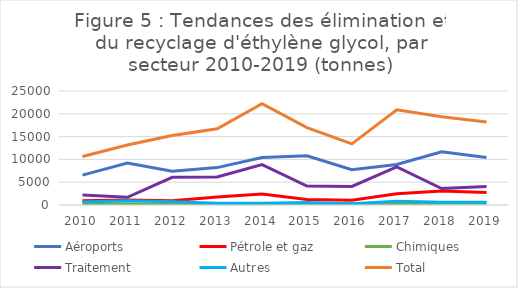
| Category | Aéroports | Pétrole et gaz | Chimiques | Traitement | Autres | Total |
|---|---|---|---|---|---|---|
| 2010.0 | 6556.238 | 919.849 | 302.821 | 2180.765 | 681.843 | 10641.516 |
| 2011.0 | 9211.399 | 1100.927 | 245.741 | 1698.064 | 914.847 | 13170.977 |
| 2012.0 | 7409.109 | 932.151 | 142.349 | 6061.822 | 715.861 | 15261.292 |
| 2013.0 | 8203.413 | 1729.749 | 251.326 | 6164.561 | 385.289 | 16734.339 |
| 2014.0 | 10404.209 | 2423.471 | 154.614 | 8870.51 | 362.522 | 22215.326 |
| 2015.0 | 10803.566 | 1224.559 | 242.982 | 4140.246 | 541.717 | 16953.07 |
| 2016.0 | 7734.227 | 1040.017 | 262.175 | 4067.072 | 299.025 | 13402.517 |
| 2017.0 | 8890.602 | 2488.321 | 300.404 | 8373.433 | 834.083 | 20886.843 |
| 2018.0 | 11679.496 | 3093.302 | 379.128 | 3601.959 | 604.397 | 19358.28 |
| 2019.0 | 10428.842 | 2737.493 | 367.573 | 4067.856 | 605.215 | 18206.98 |